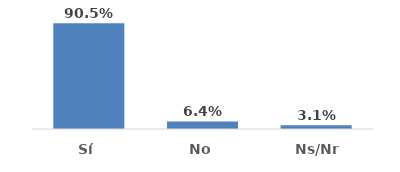
| Category | Series 0 |
|---|---|
| Sí | 0.905 |
| No | 0.064 |
| Ns/Nr | 0.031 |